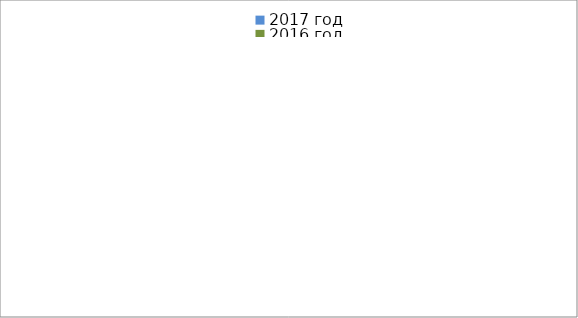
| Category | 2017 год | 2016 год |
|---|---|---|
|  - поджог | 3 | 24 |
|  - неосторожное обращение с огнём | 4 | 17 |
|  - НПТЭ электрооборудования | 11 | 8 |
|  - НПУ и Э печей | 26 | 25 |
|  - НПУ и Э транспортных средств | 36 | 15 |
|   -Шалость с огнем детей | 4 | 5 |
|  -НППБ при эксплуатации эл.приборов | 19 | 5 |
|  - курение | 21 | 7 |
| - прочие | 45 | 54 |
| - не установленные причины | 0 | 11 |